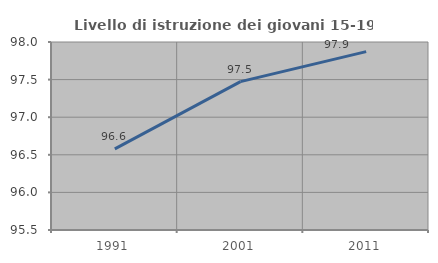
| Category | Livello di istruzione dei giovani 15-19 anni |
|---|---|
| 1991.0 | 96.579 |
| 2001.0 | 97.473 |
| 2011.0 | 97.872 |